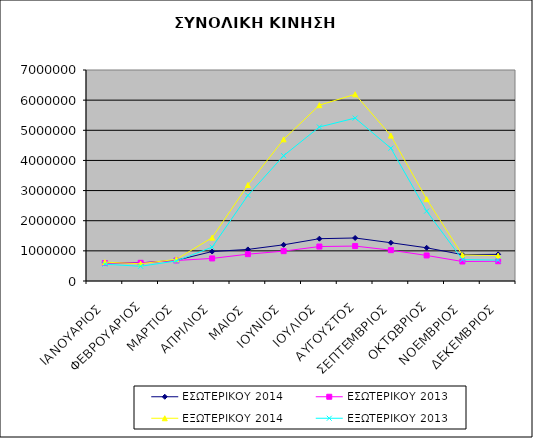
| Category | ΕΣΩΤΕΡΙΚΟΥ 2014 | ΕΣΩΤΕΡΙΚΟΥ 2013 | ΕΞΩΤΕΡΙΚΟΥ 2014 | ΕΞΩΤΕΡΙΚΟΥ 2013 |
|---|---|---|---|---|
| ΙΑΝΟΥΑΡΙΟΣ | 605894 | 596670 | 625045 | 555838 |
| ΦΕΒΡΟΥΑΡΙΟΣ | 601285 | 603615 | 571905 | 489189 |
| ΜΑΡΤΙΟΣ | 686964 | 680181 | 719389 | 664953 |
| ΑΠΡΙΛΙΟΣ | 977628 | 748586 | 1438399 | 1122274 |
| ΜΑΙΟΣ | 1048085 | 890122 | 3185210 | 2841671 |
| ΙΟΥΝΙΟΣ | 1200545 | 990205 | 4699237 | 4157581 |
| ΙΟΥΛΙΟΣ | 1403252 | 1143141 | 5832928 | 5109571 |
| ΑΥΓΟΥΣΤΟΣ | 1427189 | 1158675 | 6193839 | 5405505 |
| ΣΕΠΤΕΜΒΡΙΟΣ | 1269365 | 1023001 | 4823076 | 4405983 |
| ΟΚΤΩΒΡΙΟΣ | 1101704 | 847264 | 2715213 | 2319025 |
| ΝΟΕΜΒΡΙΟΣ | 875238 | 646811 | 864810 | 708671 |
| ΔΕΚΕΜΒΡΙΟΣ | 883832 | 655474 | 842242 | 693335 |